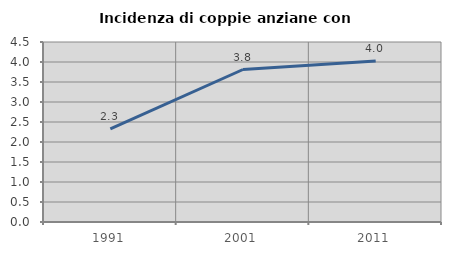
| Category | Incidenza di coppie anziane con figli |
|---|---|
| 1991.0 | 2.326 |
| 2001.0 | 3.812 |
| 2011.0 | 4.024 |